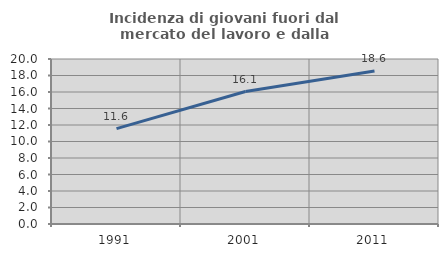
| Category | Incidenza di giovani fuori dal mercato del lavoro e dalla formazione  |
|---|---|
| 1991.0 | 11.558 |
| 2001.0 | 16.058 |
| 2011.0 | 18.557 |